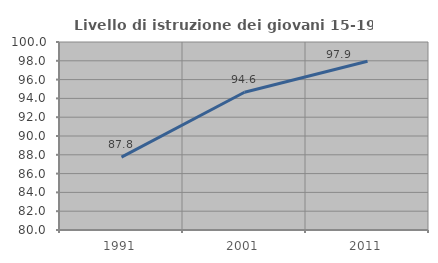
| Category | Livello di istruzione dei giovani 15-19 anni |
|---|---|
| 1991.0 | 87.755 |
| 2001.0 | 94.649 |
| 2011.0 | 97.948 |